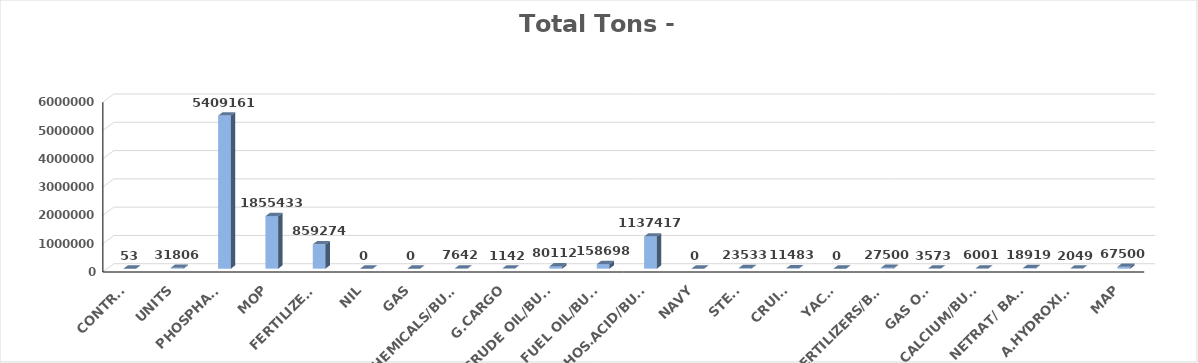
| Category | Series 0 |
|---|---|
| CONTRS. | 53 |
| UNITS | 31806 |
| PHOSPHATE | 5409161 |
| MOP | 1855433 |
| FERTILIZERS | 859274 |
| NIL | 0 |
| GAS | 0 |
| CHEMICALS/BULK | 7642 |
| G.CARGO | 1142 |
| CRUDE OIL/BULK | 80112 |
| FUEL OIL/BULK | 158698 |
| PHOS.ACID/BULK | 1137417 |
| NAVY | 0 |
| STEEL | 23533 |
| CRUISE | 11483 |
| YACHT | 0 |
| FERTILIZERS/BAGS | 27500 |
| GAS OIL | 3573 |
| CALCIUM/BULK | 6001 |
| NETRAT/ BAGS | 18919 |
| A.HYDROXIDE | 2049 |
| MAP | 67500 |